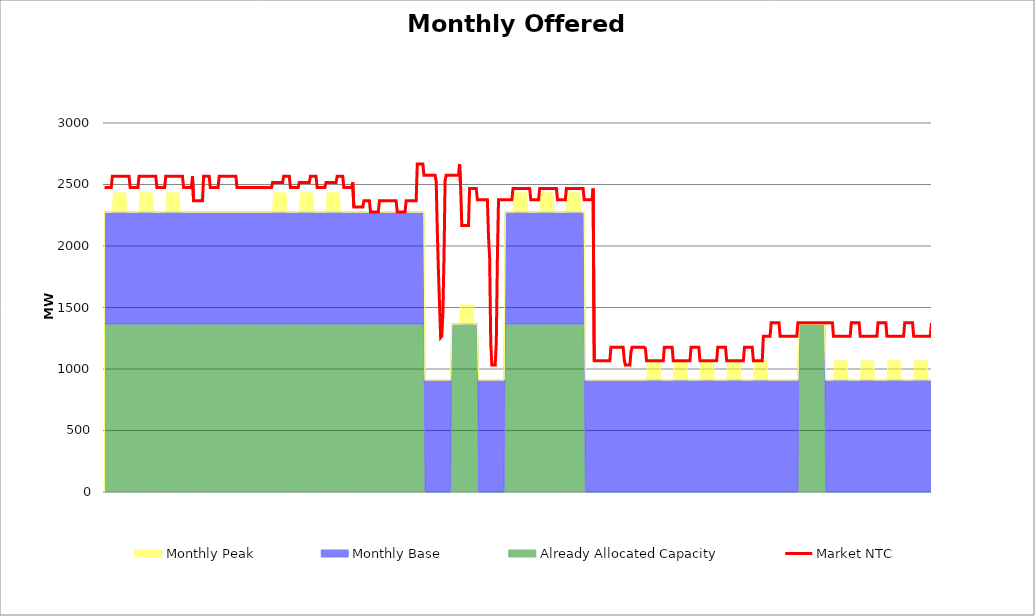
| Category | Market NTC |
|---|---|
| 0 | 2476 |
| 1 | 2476 |
| 2 | 2476 |
| 3 | 2476 |
| 4 | 2476 |
| 5 | 2476 |
| 6 | 2476 |
| 7 | 2567 |
| 8 | 2567 |
| 9 | 2567 |
| 10 | 2567 |
| 11 | 2567 |
| 12 | 2567 |
| 13 | 2567 |
| 14 | 2567 |
| 15 | 2567 |
| 16 | 2567 |
| 17 | 2567 |
| 18 | 2567 |
| 19 | 2567 |
| 20 | 2567 |
| 21 | 2567 |
| 22 | 2567 |
| 23 | 2476 |
| 24 | 2476 |
| 25 | 2476 |
| 26 | 2476 |
| 27 | 2476 |
| 28 | 2476 |
| 29 | 2476 |
| 30 | 2476 |
| 31 | 2567 |
| 32 | 2567 |
| 33 | 2567 |
| 34 | 2567 |
| 35 | 2567 |
| 36 | 2567 |
| 37 | 2567 |
| 38 | 2567 |
| 39 | 2567 |
| 40 | 2567 |
| 41 | 2567 |
| 42 | 2567 |
| 43 | 2567 |
| 44 | 2567 |
| 45 | 2567 |
| 46 | 2567 |
| 47 | 2476 |
| 48 | 2476 |
| 49 | 2476 |
| 50 | 2476 |
| 51 | 2476 |
| 52 | 2476 |
| 53 | 2476 |
| 54 | 2476 |
| 55 | 2567 |
| 56 | 2567 |
| 57 | 2567 |
| 58 | 2567 |
| 59 | 2567 |
| 60 | 2567 |
| 61 | 2567 |
| 62 | 2567 |
| 63 | 2567 |
| 64 | 2567 |
| 65 | 2567 |
| 66 | 2567 |
| 67 | 2567 |
| 68 | 2567 |
| 69 | 2567 |
| 70 | 2567 |
| 71 | 2476 |
| 72 | 2476 |
| 73 | 2476 |
| 74 | 2476 |
| 75 | 2476 |
| 76 | 2476 |
| 77 | 2476 |
| 78 | 2476 |
| 79 | 2567 |
| 80 | 2367 |
| 81 | 2367 |
| 82 | 2367 |
| 83 | 2367 |
| 84 | 2367 |
| 85 | 2367 |
| 86 | 2367 |
| 87 | 2367 |
| 88 | 2367 |
| 89 | 2567 |
| 90 | 2567 |
| 91 | 2567 |
| 92 | 2567 |
| 93 | 2567 |
| 94 | 2567 |
| 95 | 2476 |
| 96 | 2476 |
| 97 | 2476 |
| 98 | 2476 |
| 99 | 2476 |
| 100 | 2476 |
| 101 | 2476 |
| 102 | 2476 |
| 103 | 2567 |
| 104 | 2567 |
| 105 | 2567 |
| 106 | 2567 |
| 107 | 2567 |
| 108 | 2567 |
| 109 | 2567 |
| 110 | 2567 |
| 111 | 2567 |
| 112 | 2567 |
| 113 | 2567 |
| 114 | 2567 |
| 115 | 2567 |
| 116 | 2567 |
| 117 | 2567 |
| 118 | 2567 |
| 119 | 2476 |
| 120 | 2476 |
| 121 | 2476 |
| 122 | 2476 |
| 123 | 2476 |
| 124 | 2476 |
| 125 | 2476 |
| 126 | 2476 |
| 127 | 2476 |
| 128 | 2476 |
| 129 | 2476 |
| 130 | 2476 |
| 131 | 2476 |
| 132 | 2476 |
| 133 | 2476 |
| 134 | 2476 |
| 135 | 2476 |
| 136 | 2476 |
| 137 | 2476 |
| 138 | 2476 |
| 139 | 2476 |
| 140 | 2476 |
| 141 | 2476 |
| 142 | 2476 |
| 143 | 2476 |
| 144 | 2476 |
| 145 | 2476 |
| 146 | 2476 |
| 147 | 2476 |
| 148 | 2476 |
| 149 | 2476 |
| 150 | 2476 |
| 151 | 2517 |
| 152 | 2517 |
| 153 | 2517 |
| 154 | 2517 |
| 155 | 2517 |
| 156 | 2517 |
| 157 | 2517 |
| 158 | 2517 |
| 159 | 2517 |
| 160 | 2517 |
| 161 | 2567 |
| 162 | 2567 |
| 163 | 2567 |
| 164 | 2567 |
| 165 | 2567 |
| 166 | 2567 |
| 167 | 2476 |
| 168 | 2476 |
| 169 | 2476 |
| 170 | 2476 |
| 171 | 2476 |
| 172 | 2476 |
| 173 | 2476 |
| 174 | 2476 |
| 175 | 2517 |
| 176 | 2517 |
| 177 | 2517 |
| 178 | 2517 |
| 179 | 2517 |
| 180 | 2517 |
| 181 | 2517 |
| 182 | 2517 |
| 183 | 2517 |
| 184 | 2517 |
| 185 | 2567 |
| 186 | 2567 |
| 187 | 2567 |
| 188 | 2567 |
| 189 | 2567 |
| 190 | 2567 |
| 191 | 2476 |
| 192 | 2476 |
| 193 | 2476 |
| 194 | 2476 |
| 195 | 2476 |
| 196 | 2476 |
| 197 | 2476 |
| 198 | 2476 |
| 199 | 2517 |
| 200 | 2517 |
| 201 | 2517 |
| 202 | 2517 |
| 203 | 2517 |
| 204 | 2517 |
| 205 | 2517 |
| 206 | 2517 |
| 207 | 2517 |
| 208 | 2517 |
| 209 | 2567 |
| 210 | 2567 |
| 211 | 2567 |
| 212 | 2567 |
| 213 | 2567 |
| 214 | 2567 |
| 215 | 2476 |
| 216 | 2476 |
| 217 | 2476 |
| 218 | 2476 |
| 219 | 2476 |
| 220 | 2476 |
| 221 | 2476 |
| 222 | 2476 |
| 223 | 2517 |
| 224 | 2317 |
| 225 | 2317 |
| 226 | 2317 |
| 227 | 2317 |
| 228 | 2317 |
| 229 | 2317 |
| 230 | 2317 |
| 231 | 2317 |
| 232 | 2317 |
| 233 | 2367 |
| 234 | 2367 |
| 235 | 2367 |
| 236 | 2367 |
| 237 | 2367 |
| 238 | 2367 |
| 239 | 2276 |
| 240 | 2276 |
| 241 | 2276 |
| 242 | 2276 |
| 243 | 2276 |
| 244 | 2276 |
| 245 | 2276 |
| 246 | 2276 |
| 247 | 2367 |
| 248 | 2367 |
| 249 | 2367 |
| 250 | 2367 |
| 251 | 2367 |
| 252 | 2367 |
| 253 | 2367 |
| 254 | 2367 |
| 255 | 2367 |
| 256 | 2367 |
| 257 | 2367 |
| 258 | 2367 |
| 259 | 2367 |
| 260 | 2367 |
| 261 | 2367 |
| 262 | 2367 |
| 263 | 2276 |
| 264 | 2276 |
| 265 | 2276 |
| 266 | 2276 |
| 267 | 2276 |
| 268 | 2276 |
| 269 | 2276 |
| 270 | 2276 |
| 271 | 2367 |
| 272 | 2367 |
| 273 | 2367 |
| 274 | 2367 |
| 275 | 2367 |
| 276 | 2367 |
| 277 | 2367 |
| 278 | 2367 |
| 279 | 2367 |
| 280 | 2367 |
| 281 | 2667 |
| 282 | 2667 |
| 283 | 2667 |
| 284 | 2667 |
| 285 | 2667 |
| 286 | 2667 |
| 287 | 2576 |
| 288 | 2576 |
| 289 | 2576 |
| 290 | 2576 |
| 291 | 2576 |
| 292 | 2576 |
| 293 | 2576 |
| 294 | 2576 |
| 295 | 2576 |
| 296 | 2576 |
| 297 | 2576 |
| 298 | 2522 |
| 299 | 2120 |
| 300 | 1796 |
| 301 | 1520 |
| 302 | 1256 |
| 303 | 1267 |
| 304 | 1454 |
| 305 | 1912 |
| 306 | 2531 |
| 307 | 2576 |
| 308 | 2576 |
| 309 | 2576 |
| 310 | 2576 |
| 311 | 2576 |
| 312 | 2576 |
| 313 | 2576 |
| 314 | 2576 |
| 315 | 2576 |
| 316 | 2576 |
| 317 | 2576 |
| 318 | 2576 |
| 319 | 2667 |
| 320 | 2467 |
| 321 | 2167 |
| 322 | 2167 |
| 323 | 2167 |
| 324 | 2167 |
| 325 | 2167 |
| 326 | 2167 |
| 327 | 2167 |
| 328 | 2467 |
| 329 | 2467 |
| 330 | 2467 |
| 331 | 2467 |
| 332 | 2467 |
| 333 | 2467 |
| 334 | 2467 |
| 335 | 2376 |
| 336 | 2376 |
| 337 | 2376 |
| 338 | 2376 |
| 339 | 2376 |
| 340 | 2376 |
| 341 | 2376 |
| 342 | 2376 |
| 343 | 2376 |
| 344 | 2376 |
| 345 | 2076 |
| 346 | 1911 |
| 347 | 1217 |
| 348 | 1032 |
| 349 | 1032 |
| 350 | 1032 |
| 351 | 1032 |
| 352 | 1217 |
| 353 | 1911 |
| 354 | 2376 |
| 355 | 2376 |
| 356 | 2376 |
| 357 | 2376 |
| 358 | 2376 |
| 359 | 2376 |
| 360 | 2376 |
| 361 | 2376 |
| 362 | 2376 |
| 363 | 2376 |
| 364 | 2376 |
| 365 | 2376 |
| 366 | 2376 |
| 367 | 2467 |
| 368 | 2467 |
| 369 | 2467 |
| 370 | 2467 |
| 371 | 2467 |
| 372 | 2467 |
| 373 | 2467 |
| 374 | 2467 |
| 375 | 2467 |
| 376 | 2467 |
| 377 | 2467 |
| 378 | 2467 |
| 379 | 2467 |
| 380 | 2467 |
| 381 | 2467 |
| 382 | 2467 |
| 383 | 2376 |
| 384 | 2376 |
| 385 | 2376 |
| 386 | 2376 |
| 387 | 2376 |
| 388 | 2376 |
| 389 | 2376 |
| 390 | 2376 |
| 391 | 2467 |
| 392 | 2467 |
| 393 | 2467 |
| 394 | 2467 |
| 395 | 2467 |
| 396 | 2467 |
| 397 | 2467 |
| 398 | 2467 |
| 399 | 2467 |
| 400 | 2467 |
| 401 | 2467 |
| 402 | 2467 |
| 403 | 2467 |
| 404 | 2467 |
| 405 | 2467 |
| 406 | 2467 |
| 407 | 2376 |
| 408 | 2376 |
| 409 | 2376 |
| 410 | 2376 |
| 411 | 2376 |
| 412 | 2376 |
| 413 | 2376 |
| 414 | 2376 |
| 415 | 2467 |
| 416 | 2467 |
| 417 | 2467 |
| 418 | 2467 |
| 419 | 2467 |
| 420 | 2467 |
| 421 | 2467 |
| 422 | 2467 |
| 423 | 2467 |
| 424 | 2467 |
| 425 | 2467 |
| 426 | 2467 |
| 427 | 2467 |
| 428 | 2467 |
| 429 | 2467 |
| 430 | 2467 |
| 431 | 2376 |
| 432 | 2376 |
| 433 | 2376 |
| 434 | 2376 |
| 435 | 2376 |
| 436 | 2376 |
| 437 | 2376 |
| 438 | 2376 |
| 439 | 2467 |
| 440 | 1067 |
| 441 | 1067 |
| 442 | 1067 |
| 443 | 1067 |
| 444 | 1067 |
| 445 | 1067 |
| 446 | 1067 |
| 447 | 1067 |
| 448 | 1067 |
| 449 | 1067 |
| 450 | 1067 |
| 451 | 1067 |
| 452 | 1067 |
| 453 | 1067 |
| 454 | 1067 |
| 455 | 1176 |
| 456 | 1176 |
| 457 | 1176 |
| 458 | 1176 |
| 459 | 1176 |
| 460 | 1176 |
| 461 | 1176 |
| 462 | 1176 |
| 463 | 1176 |
| 464 | 1176 |
| 465 | 1176 |
| 466 | 1176 |
| 467 | 1073 |
| 468 | 1032 |
| 469 | 1032 |
| 470 | 1032 |
| 471 | 1032 |
| 472 | 1032 |
| 473 | 1139 |
| 474 | 1176 |
| 475 | 1176 |
| 476 | 1176 |
| 477 | 1176 |
| 478 | 1176 |
| 479 | 1176 |
| 480 | 1176 |
| 481 | 1176 |
| 482 | 1176 |
| 483 | 1176 |
| 484 | 1176 |
| 485 | 1176 |
| 486 | 1168 |
| 487 | 1067 |
| 488 | 1067 |
| 489 | 1067 |
| 490 | 1067 |
| 491 | 1067 |
| 492 | 1067 |
| 493 | 1067 |
| 494 | 1067 |
| 495 | 1067 |
| 496 | 1067 |
| 497 | 1067 |
| 498 | 1067 |
| 499 | 1067 |
| 500 | 1067 |
| 501 | 1067 |
| 502 | 1067 |
| 503 | 1176 |
| 504 | 1176 |
| 505 | 1176 |
| 506 | 1176 |
| 507 | 1176 |
| 508 | 1176 |
| 509 | 1176 |
| 510 | 1176 |
| 511 | 1067 |
| 512 | 1067 |
| 513 | 1067 |
| 514 | 1067 |
| 515 | 1067 |
| 516 | 1067 |
| 517 | 1067 |
| 518 | 1067 |
| 519 | 1067 |
| 520 | 1067 |
| 521 | 1067 |
| 522 | 1067 |
| 523 | 1067 |
| 524 | 1067 |
| 525 | 1067 |
| 526 | 1067 |
| 527 | 1176 |
| 528 | 1176 |
| 529 | 1176 |
| 530 | 1176 |
| 531 | 1176 |
| 532 | 1176 |
| 533 | 1176 |
| 534 | 1176 |
| 535 | 1067 |
| 536 | 1067 |
| 537 | 1067 |
| 538 | 1067 |
| 539 | 1067 |
| 540 | 1067 |
| 541 | 1067 |
| 542 | 1067 |
| 543 | 1067 |
| 544 | 1067 |
| 545 | 1067 |
| 546 | 1067 |
| 547 | 1067 |
| 548 | 1067 |
| 549 | 1067 |
| 550 | 1067 |
| 551 | 1176 |
| 552 | 1176 |
| 553 | 1176 |
| 554 | 1176 |
| 555 | 1176 |
| 556 | 1176 |
| 557 | 1176 |
| 558 | 1176 |
| 559 | 1067 |
| 560 | 1067 |
| 561 | 1067 |
| 562 | 1067 |
| 563 | 1067 |
| 564 | 1067 |
| 565 | 1067 |
| 566 | 1067 |
| 567 | 1067 |
| 568 | 1067 |
| 569 | 1067 |
| 570 | 1067 |
| 571 | 1067 |
| 572 | 1067 |
| 573 | 1067 |
| 574 | 1067 |
| 575 | 1176 |
| 576 | 1176 |
| 577 | 1176 |
| 578 | 1176 |
| 579 | 1176 |
| 580 | 1176 |
| 581 | 1176 |
| 582 | 1176 |
| 583 | 1067 |
| 584 | 1067 |
| 585 | 1067 |
| 586 | 1067 |
| 587 | 1067 |
| 588 | 1067 |
| 589 | 1067 |
| 590 | 1067 |
| 591 | 1067 |
| 592 | 1267 |
| 593 | 1267 |
| 594 | 1267 |
| 595 | 1267 |
| 596 | 1267 |
| 597 | 1267 |
| 598 | 1267 |
| 599 | 1376 |
| 600 | 1376 |
| 601 | 1376 |
| 602 | 1376 |
| 603 | 1376 |
| 604 | 1376 |
| 605 | 1376 |
| 606 | 1376 |
| 607 | 1267 |
| 608 | 1267 |
| 609 | 1267 |
| 610 | 1267 |
| 611 | 1267 |
| 612 | 1267 |
| 613 | 1267 |
| 614 | 1267 |
| 615 | 1267 |
| 616 | 1267 |
| 617 | 1267 |
| 618 | 1267 |
| 619 | 1267 |
| 620 | 1267 |
| 621 | 1267 |
| 622 | 1267 |
| 623 | 1376 |
| 624 | 1376 |
| 625 | 1376 |
| 626 | 1376 |
| 627 | 1376 |
| 628 | 1376 |
| 629 | 1376 |
| 630 | 1376 |
| 631 | 1376 |
| 632 | 1376 |
| 633 | 1376 |
| 634 | 1376 |
| 635 | 1376 |
| 636 | 1376 |
| 637 | 1376 |
| 638 | 1376 |
| 639 | 1376 |
| 640 | 1376 |
| 641 | 1376 |
| 642 | 1376 |
| 643 | 1376 |
| 644 | 1376 |
| 645 | 1376 |
| 646 | 1376 |
| 647 | 1376 |
| 648 | 1376 |
| 649 | 1376 |
| 650 | 1376 |
| 651 | 1376 |
| 652 | 1376 |
| 653 | 1376 |
| 654 | 1376 |
| 655 | 1267 |
| 656 | 1267 |
| 657 | 1267 |
| 658 | 1267 |
| 659 | 1267 |
| 660 | 1267 |
| 661 | 1267 |
| 662 | 1267 |
| 663 | 1267 |
| 664 | 1267 |
| 665 | 1267 |
| 666 | 1267 |
| 667 | 1267 |
| 668 | 1267 |
| 669 | 1267 |
| 670 | 1267 |
| 671 | 1376 |
| 672 | 1376 |
| 673 | 1376 |
| 674 | 1376 |
| 675 | 1376 |
| 676 | 1376 |
| 677 | 1376 |
| 678 | 1376 |
| 679 | 1267 |
| 680 | 1267 |
| 681 | 1267 |
| 682 | 1267 |
| 683 | 1267 |
| 684 | 1267 |
| 685 | 1267 |
| 686 | 1267 |
| 687 | 1267 |
| 688 | 1267 |
| 689 | 1267 |
| 690 | 1267 |
| 691 | 1267 |
| 692 | 1267 |
| 693 | 1267 |
| 694 | 1267 |
| 695 | 1376 |
| 696 | 1376 |
| 697 | 1376 |
| 698 | 1376 |
| 699 | 1376 |
| 700 | 1376 |
| 701 | 1376 |
| 702 | 1376 |
| 703 | 1267 |
| 704 | 1267 |
| 705 | 1267 |
| 706 | 1267 |
| 707 | 1267 |
| 708 | 1267 |
| 709 | 1267 |
| 710 | 1267 |
| 711 | 1267 |
| 712 | 1267 |
| 713 | 1267 |
| 714 | 1267 |
| 715 | 1267 |
| 716 | 1267 |
| 717 | 1267 |
| 718 | 1267 |
| 719 | 1376 |
| 720 | 1376 |
| 721 | 1376 |
| 722 | 1376 |
| 723 | 1376 |
| 724 | 1376 |
| 725 | 1376 |
| 726 | 1376 |
| 727 | 1267 |
| 728 | 1267 |
| 729 | 1267 |
| 730 | 1267 |
| 731 | 1267 |
| 732 | 1267 |
| 733 | 1267 |
| 734 | 1267 |
| 735 | 1267 |
| 736 | 1267 |
| 737 | 1267 |
| 738 | 1267 |
| 739 | 1267 |
| 740 | 1267 |
| 741 | 1267 |
| 742 | 1267 |
| 743 | 1376 |